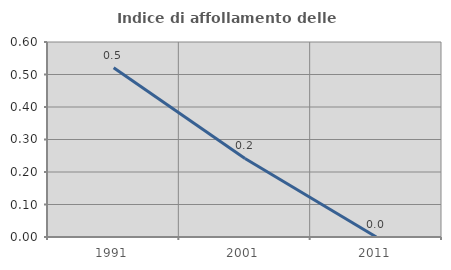
| Category | Indice di affollamento delle abitazioni  |
|---|---|
| 1991.0 | 0.521 |
| 2001.0 | 0.242 |
| 2011.0 | 0 |